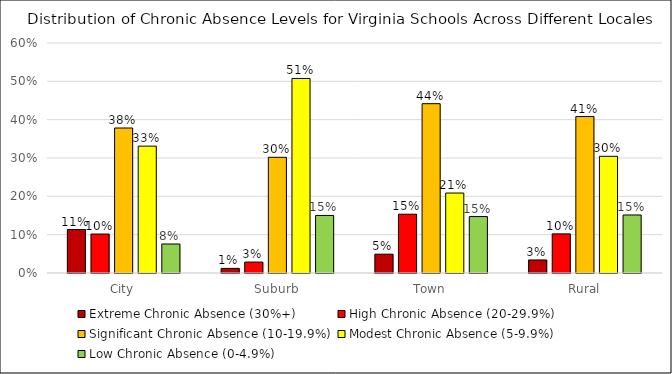
| Category | Extreme Chronic Absence (30%+) | High Chronic Absence (20-29.9%) | Significant Chronic Absence (10-19.9%) | Modest Chronic Absence (5-9.9%) | Low Chronic Absence (0-4.9%) |
|---|---|---|---|---|---|
| City | 0.113 | 0.102 | 0.378 | 0.331 | 0.076 |
| Suburb | 0.012 | 0.029 | 0.302 | 0.508 | 0.15 |
| Town | 0.049 | 0.153 | 0.442 | 0.209 | 0.147 |
| Rural | 0.034 | 0.102 | 0.408 | 0.304 | 0.151 |